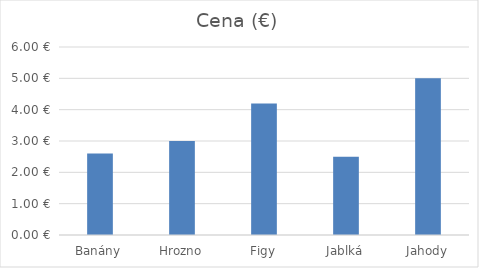
| Category | Cena (€) |
|---|---|
| Banány | 2.6 |
| Hrozno | 3 |
| Figy | 4.2 |
| Jablká | 2.5 |
| Jahody | 5 |